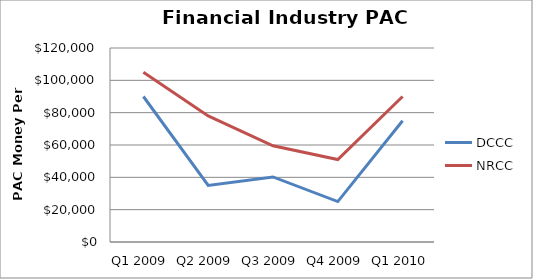
| Category | DCCC | NRCC |
|---|---|---|
| Q1 2009 | 90000 | 105000 |
| Q2 2009 | 35000 | 78000 |
| Q3 2009 | 40250 | 59500 |
| Q4 2009 | 25000 | 51000 |
| Q1 2010 | 75000 | 90000 |